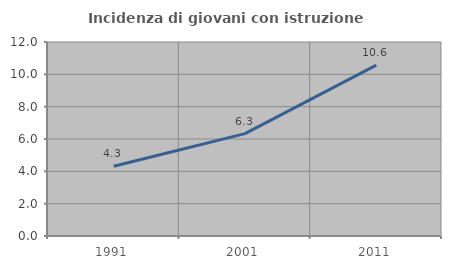
| Category | Incidenza di giovani con istruzione universitaria |
|---|---|
| 1991.0 | 4.31 |
| 2001.0 | 6.332 |
| 2011.0 | 10.571 |